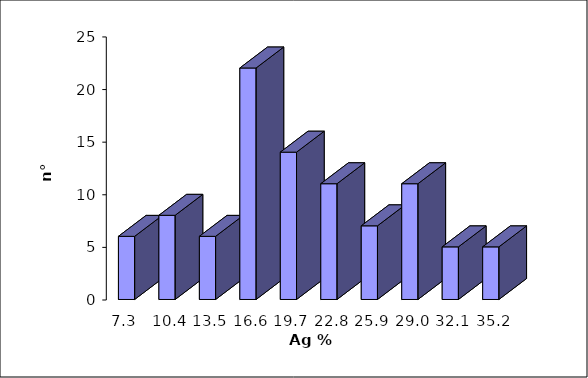
| Category | Series 0 |
|---|---|
| 7.255 | 6 |
| 10.365 | 8 |
| 13.475 | 6 |
| 16.585 | 22 |
| 19.695 | 14 |
| 22.805 | 11 |
| 25.915 | 7 |
| 29.025 | 11 |
| 32.135 | 5 |
| 35.245 | 5 |